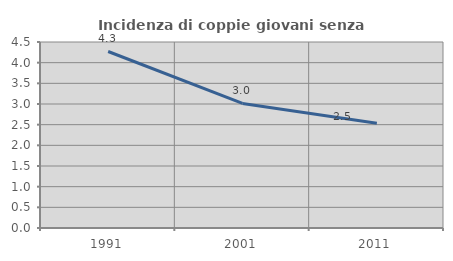
| Category | Incidenza di coppie giovani senza figli |
|---|---|
| 1991.0 | 4.27 |
| 2001.0 | 3.014 |
| 2011.0 | 2.536 |